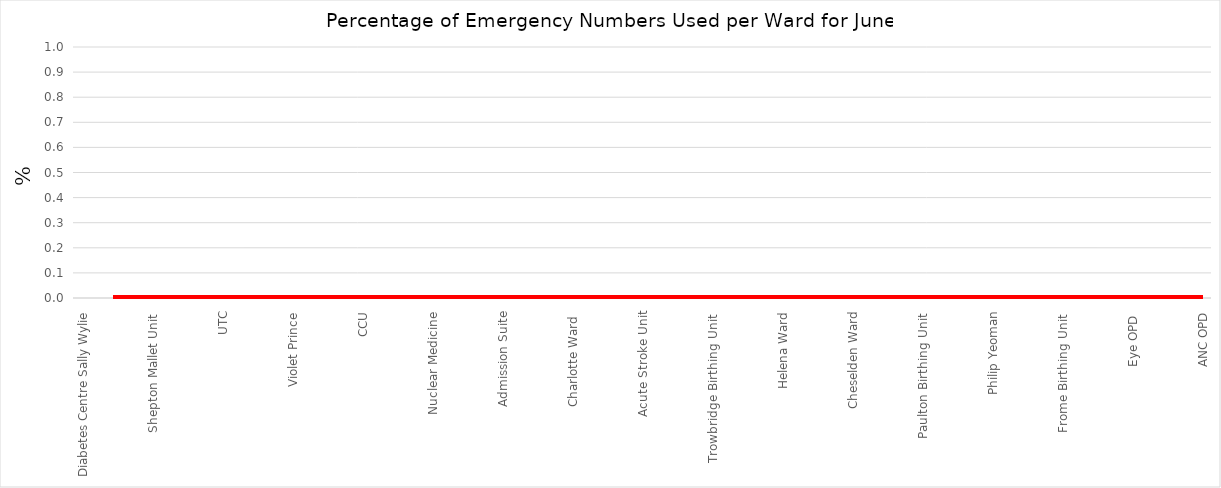
| Category | Series 0 |
|---|---|
| Diabetes Centre Sally Wylie | 0 |
| Diabetes link nurse | 0 |
| Diabetes Centre | 0 |
| Chippenham Birthing Unit  | 0 |
| Shepton Mallet Unit  | 0 |
| BBC | 0 |
| Childrens OPD  | 0 |
| Eye Ward | 0 |
| UTC | 0 |
| Dermatology | 0 |
| X-Ray | 0 |
| Urology OPD | 0 |
| Violet Prince | 0 |
| PET9 CS | 0 |
| Pre assessment | 0 |
| SSSU ( day surgery recovery) | 0 |
| CCU | 0 |
| SAU | 0 |
| Gastro Unit | 0 |
| Haygarth | 0 |
| Nuclear Medicine | 0 |
| Vascular Studies | 0 |
| Wolfson Centre | 0 |
| Pain clinic | 0 |
| Admission Suite | 0 |
| Medical Therapies Unit | 0 |
| Pierce ward | 0 |
| ITU Ketone + Glucose | 0 |
| Charlotte Ward  | 0 |
| Robin Smith Ward | 0 |
| Day Surgery Ward | 0 |
| ACE OPU | 0 |
| Acute Stroke Unit | 0 |
| Parry Ward | 0 |
| Combe Ward | 0 |
| Forrester Brown | 0 |
| Trowbridge Birthing Unit  | 0 |
| Respiratory Ward | 0 |
| Parry ward Ketone + Glucose | 0 |
| Midford Ward | 0 |
| Helena Ward | 0 |
| William Budd Ward | 0 |
| Cardiac Ward | 0 |
| Theatres Recovery | 0 |
| Cheselden Ward | 0 |
| Waterhouse Ward | 0 |
| Philip Yeoman Ortho Recovery | 0 |
| MAU | 0 |
| Paulton Birthing Unit  | 0 |
| MAU Ketone Only | 0 |
| Medical short stay Ward | 0 |
| A & E ketone | 0 |
| Philip Yeoman | 0 |
| NICU | 0 |
| Ambulatory care  | 0 |
| Will Budd Day Case & ONC OPD | 0 |
| Frome Birthing Unit  | 0 |
| Pulteney Ward | 0 |
| A&E | 0 |
| Mary Ward  | 0 |
| Eye OPD  | 0 |
| Cardiac Cath Lab | 0 |
| Childrens Ward  | 0 |
| PAW Recovery (Theatres) | 0 |
| ANC OPD | 0 |